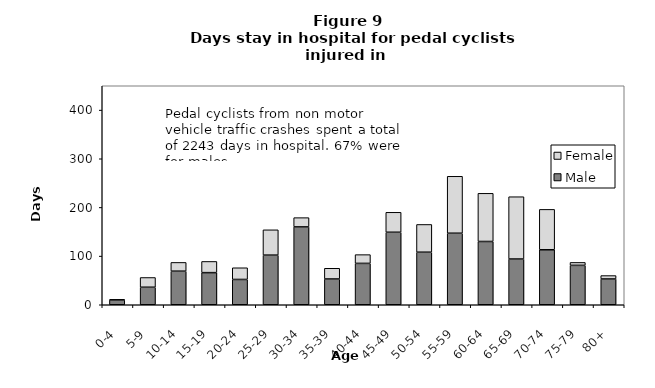
| Category | Male | Female |
|---|---|---|
| 0-4 | 10 | 1 |
| 5-9 | 36 | 20 |
| 10-14 | 69 | 18 |
| 15-19 | 66 | 23 |
| 20-24 | 52 | 24 |
| 25-29 | 102 | 52 |
| 30-34 | 160 | 19 |
| 35-39 | 53 | 22 |
| 40-44 | 85 | 18 |
| 45-49 | 149 | 41 |
| 50-54 | 108 | 57 |
| 55-59 | 147 | 117 |
| 60-64 | 130 | 99 |
| 65-69 | 94 | 128 |
| 70-74 | 113 | 83 |
| 75-79 | 81 | 6 |
| 80+ | 53 | 7 |